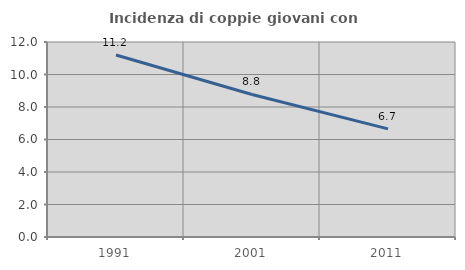
| Category | Incidenza di coppie giovani con figli |
|---|---|
| 1991.0 | 11.202 |
| 2001.0 | 8.772 |
| 2011.0 | 6.654 |